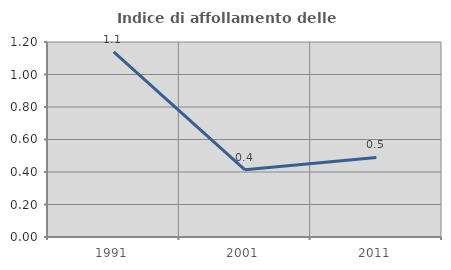
| Category | Indice di affollamento delle abitazioni  |
|---|---|
| 1991.0 | 1.14 |
| 2001.0 | 0.413 |
| 2011.0 | 0.49 |